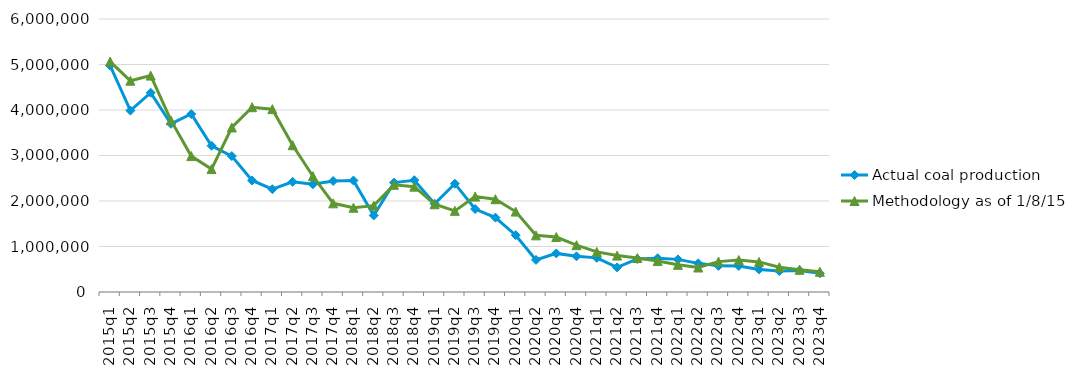
| Category | Actual coal production | Methodology as of 1/8/15 |
|---|---|---|
| 2015q1 | 4976095 | 5064899 |
| 2015q2 | 3987170 | 4643264 |
| 2015q3 | 4380040 | 4756297 |
| 2015q4 | 3697670 | 3771714 |
| 2016q1 | 3911597 | 2987382 |
| 2016q2 | 3214785 | 2701254 |
| 2016q3 | 2987087 | 3615911 |
| 2016q4 | 2450660 | 4061301 |
| 2017q1 | 2259316 | 4018797 |
| 2017q2 | 2421255 | 3226036 |
| 2017q3 | 2367859 | 2544314 |
| 2017q4 | 2440464 | 1949107 |
| 2018q1 | 2450072 | 1851657 |
| 2018q2 | 1682252 | 1898158 |
| 2018q3 | 2403705 | 2355565 |
| 2018q4 | 2456742 | 2315702 |
| 2019q1 | 1940296 | 1928173 |
| 2019q2 | 2380545 | 1783408 |
| 2019q3 | 1823188 | 2096906 |
| 2019q4 | 1635073 | 2039065 |
| 2020q1 | 1248665 | 1767361 |
| 2020q2 | 705598 | 1245098 |
| 2020q3 | 848534 | 1208209 |
| 2020q4 | 783708 | 1029018 |
| 2021q1 | 750226 | 881023 |
| 2021q2 | 540735 | 800041 |
| 2021q3 | 726846 | 746612 |
| 2021q4 | 741407 | 679894 |
| 2022q1 | 717026 | 596958 |
| 2022q2 | 629485 | 538438 |
| 2022q3 | 574335 | 667781 |
| 2022q4 | 571468 | 702907 |
| 2023q1 | 496686 | 661517 |
| 2023q2 | 461182 | 544613 |
| 2023q3 | 474771 | 488368 |
| 2023q4 | 410476 | 445286 |